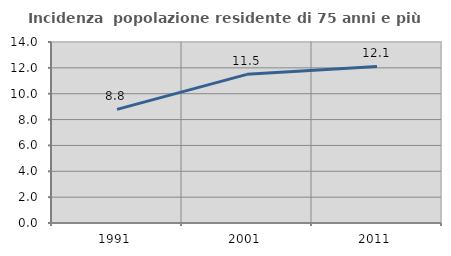
| Category | Incidenza  popolazione residente di 75 anni e più |
|---|---|
| 1991.0 | 8.786 |
| 2001.0 | 11.496 |
| 2011.0 | 12.113 |